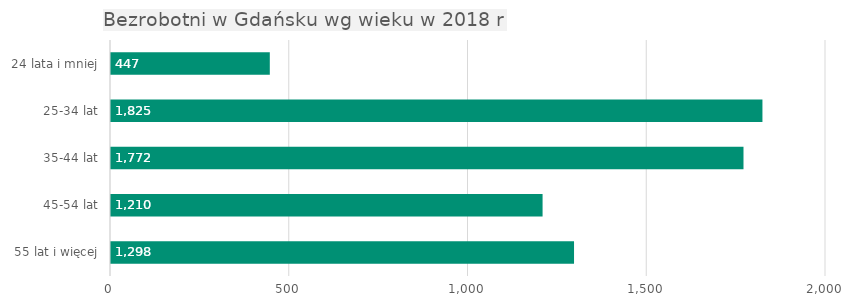
| Category | Series 0 |
|---|---|
| 24 lata i mniej | 447 |
| 25-34 lat | 1825 |
| 35-44 lat | 1772 |
| 45-54 lat | 1210 |
| 55 lat i więcej | 1298 |